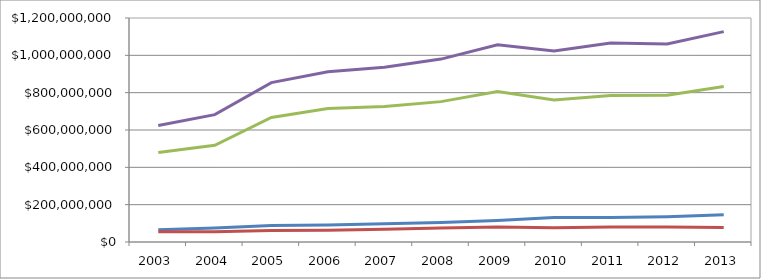
| Category | Fundraising | Administration  | Overseas projects  | Total expenditure  |
|---|---|---|---|---|
| 2003 | 65732891.308 | 55188673.074 | 478929634.824 | 623840709.221 |
| 2004 | 75525906.248 | 54731328.382 | 518140960.01 | 682274456.412 |
| 2005 | 88457363.913 | 61470909.031 | 667200746.663 | 853958659.119 |
| 2006 | 91259310.584 | 62683362.705 | 715735439.241 | 912257651.134 |
| 2007 | 97127692.926 | 68165639.106 | 725456419.881 | 936685827.59 |
| 2008 | 103889649.699 | 74555035.616 | 751991714.376 | 979829206.122 |
| 2009 | 114839890.631 | 80657724.31 | 806017696.835 | 1056218648.689 |
| 2010 | 131615746.743 | 76937962.305 | 760876111.136 | 1023558691.253 |
| 2011 | 131669896.032 | 80568328.992 | 785094550.48 | 1066352705.867 |
| 2012 | 135903546.442 | 79966222.705 | 786475087.08 | 1061000141.315 |
| 2013 | 146581391 | 77749660 | 833154460 | 1127112983 |